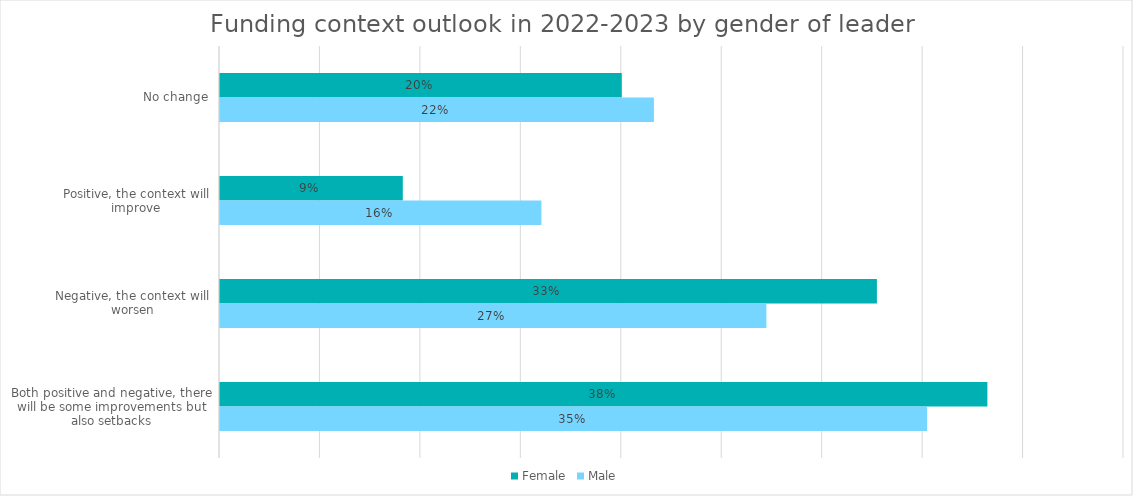
| Category | Female | Male |
|---|---|---|
| No change | 0.2 | 0.216 |
| Positive, the context will improve | 0.091 | 0.16 |
| Negative, the context will worsen | 0.327 | 0.272 |
| Both positive and negative, there will be some improvements but also setbacks | 0.382 | 0.352 |